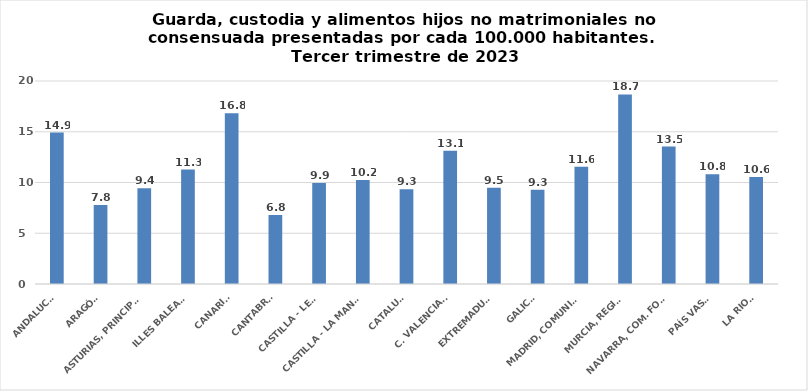
| Category | Series 0 |
|---|---|
| ANDALUCÍA | 14.923 |
| ARAGÓN | 7.782 |
| ASTURIAS, PRINCIPADO | 9.438 |
| ILLES BALEARS | 11.27 |
| CANARIAS | 16.81 |
| CANTABRIA | 6.797 |
| CASTILLA - LEÓN | 9.947 |
| CASTILLA - LA MANCHA | 10.237 |
| CATALUÑA | 9.343 |
| C. VALENCIANA | 13.127 |
| EXTREMADURA | 9.485 |
| GALICIA | 9.297 |
| MADRID, COMUNIDAD | 11.564 |
| MURCIA, REGIÓN | 18.677 |
| NAVARRA, COM. FORAL | 13.538 |
| PAÍS VASCO | 10.811 |
| LA RIOJA | 10.55 |